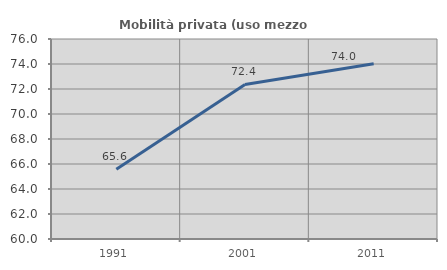
| Category | Mobilità privata (uso mezzo privato) |
|---|---|
| 1991.0 | 65.586 |
| 2001.0 | 72.365 |
| 2011.0 | 74.02 |